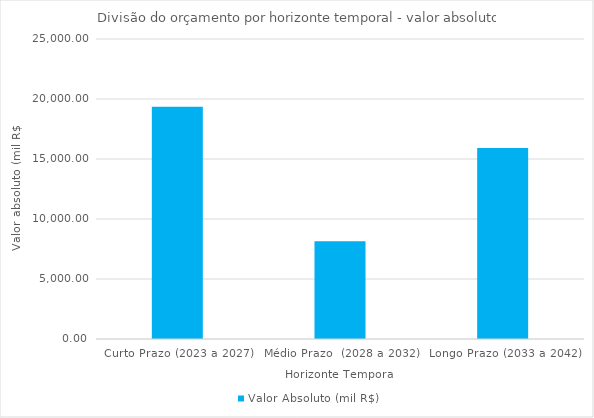
| Category | Valor Absoluto (mil R$) |
|---|---|
| Curto Prazo (2023 a 2027) | 19348.467 |
| Médio Prazo  (2028 a 2032) | 8148.925 |
| Longo Prazo (2033 a 2042) | 15915.083 |